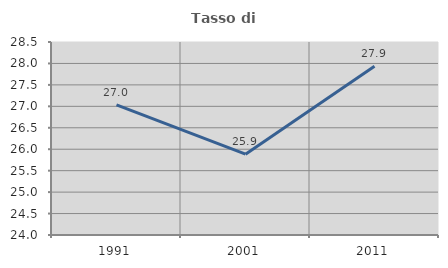
| Category | Tasso di occupazione   |
|---|---|
| 1991.0 | 27.034 |
| 2001.0 | 25.884 |
| 2011.0 | 27.937 |